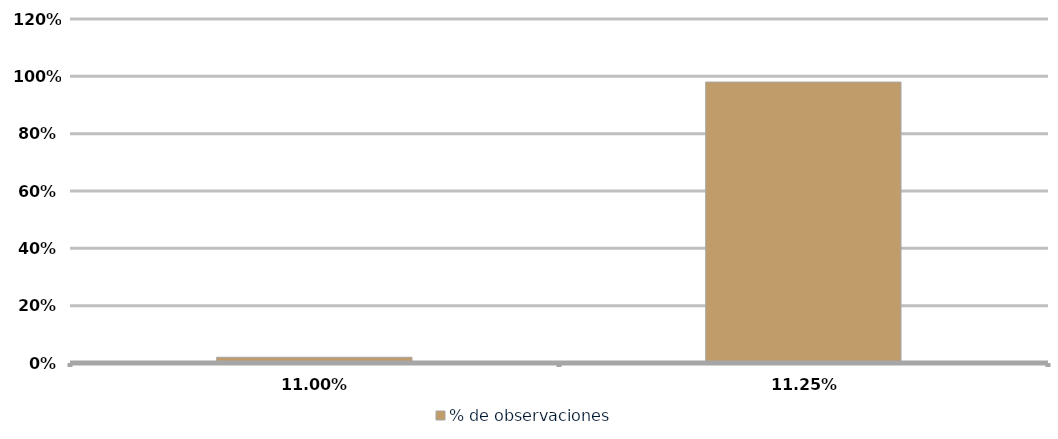
| Category | % de observaciones  |
|---|---|
| 0.11 | 0.02 |
| 0.1125 | 0.98 |